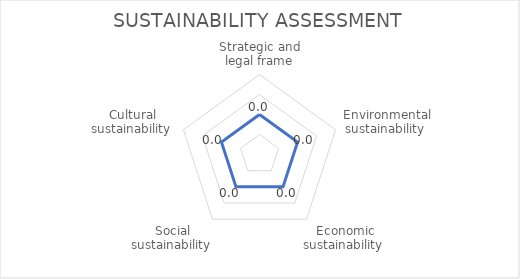
| Category | Series 0 |
|---|---|
| Strategic and legal frame | 0 |
| Environmental sustainability  | 0 |
| Economic sustainability  | 0 |
| Social sustainability  | 0 |
| Cultural sustainability  | 0 |